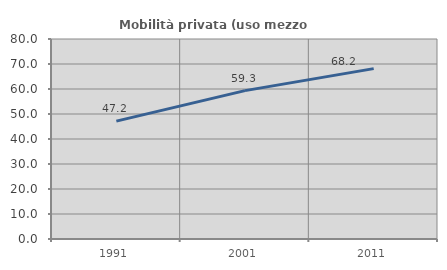
| Category | Mobilità privata (uso mezzo privato) |
|---|---|
| 1991.0 | 47.16 |
| 2001.0 | 59.345 |
| 2011.0 | 68.155 |